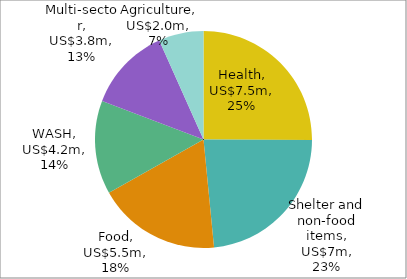
| Category | Series 0 |
|---|---|
| Health | 7.499 |
| Shelter and non-food items | 7 |
| Food | 5.5 |
| WASH | 4.176 |
| Multi-sector | 3.75 |
| Agriculture | 2 |